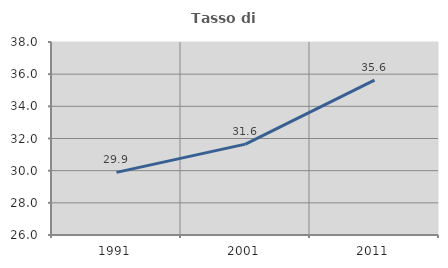
| Category | Tasso di occupazione   |
|---|---|
| 1991.0 | 29.892 |
| 2001.0 | 31.648 |
| 2011.0 | 35.627 |